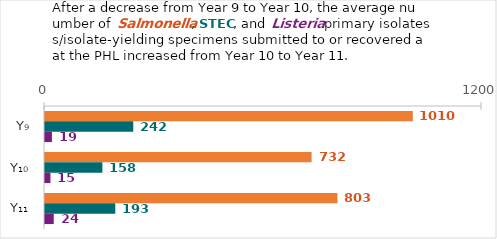
| Category | Salmonella | STEC | Listeria |
|---|---|---|---|
| Y₉ | 1010 | 242.333 | 19 |
| Y₁₀ | 732.1 | 157.6 | 15 |
| Y₁₁ | 803 | 193 | 24 |